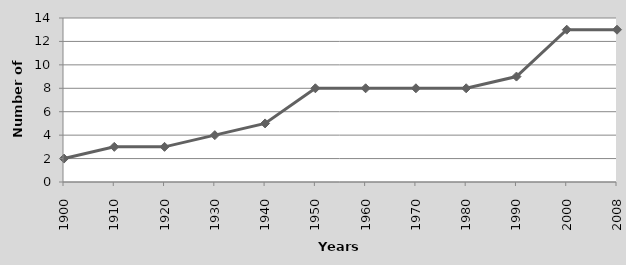
| Category | Countries with congressional control  |
|---|---|
| 1900.0 | 2 |
| 1910.0 | 3 |
| 1920.0 | 3 |
| 1930.0 | 4 |
| 1940.0 | 5 |
| 1950.0 | 8 |
| 1960.0 | 8 |
| 1970.0 | 8 |
| 1980.0 | 8 |
| 1990.0 | 9 |
| 2000.0 | 13 |
| 2008.0 | 13 |